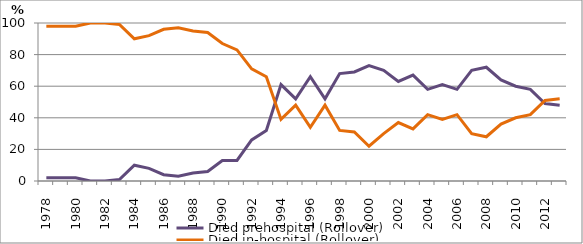
| Category | Died prehospital (Rollover) | Died in-hospital (Rollover) |
|---|---|---|
| 1978.0 | 2 | 98 |
| 1979.0 | 2 | 98 |
| 1980.0 | 2 | 98 |
| 1981.0 | 0 | 100 |
| 1982.0 | 0 | 100 |
| 1983.0 | 1 | 99 |
| 1984.0 | 10 | 90 |
| 1985.0 | 8 | 92 |
| 1986.0 | 4 | 96 |
| 1987.0 | 3 | 97 |
| 1988.0 | 5 | 95 |
| 1989.0 | 6 | 94 |
| 1990.0 | 13 | 87 |
| 1991.0 | 13 | 83 |
| 1992.0 | 26 | 71 |
| 1993.0 | 32 | 66 |
| 1994.0 | 61 | 39 |
| 1995.0 | 52 | 48 |
| 1996.0 | 66 | 34 |
| 1997.0 | 52 | 48 |
| 1998.0 | 68 | 32 |
| 1999.0 | 69 | 31 |
| 2000.0 | 73 | 22 |
| 2001.0 | 70 | 30 |
| 2002.0 | 63 | 37 |
| 2003.0 | 67 | 33 |
| 2004.0 | 58 | 42 |
| 2005.0 | 61 | 39 |
| 2006.0 | 58 | 42 |
| 2007.0 | 70 | 30 |
| 2008.0 | 72 | 28 |
| 2009.0 | 64 | 36 |
| 2010.0 | 60 | 40 |
| 2011.0 | 58 | 42 |
| 2012.0 | 49 | 51 |
| 2013.0 | 48 | 52 |